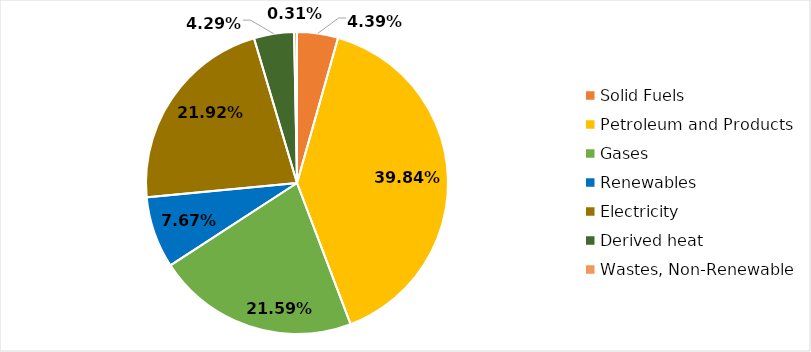
| Category | Series 0 |
|---|---|
| Solid Fuels | 0.044 |
| Petroleum and Products | 0.398 |
| Gases | 0.216 |
| Renewables | 0.077 |
| Electricity | 0.219 |
| Derived heat | 0.043 |
| Wastes, Non-Renewable | 0.003 |